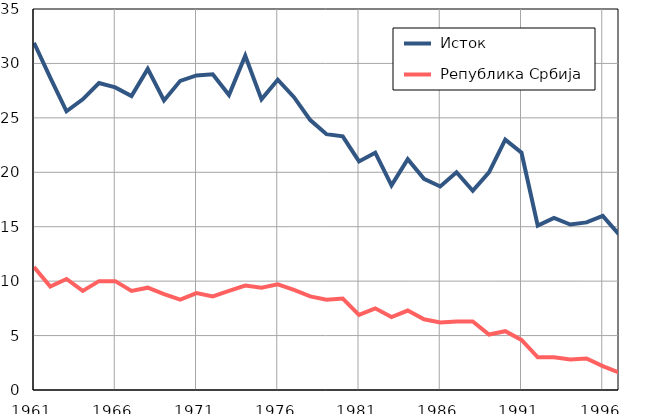
| Category |  Исток |  Република Србија |
|---|---|---|
| 1961.0 | 31.9 | 11.3 |
| 1962.0 | 28.7 | 9.5 |
| 1963.0 | 25.6 | 10.2 |
| 1964.0 | 26.7 | 9.1 |
| 1965.0 | 28.2 | 10 |
| 1966.0 | 27.8 | 10 |
| 1967.0 | 27 | 9.1 |
| 1968.0 | 29.5 | 9.4 |
| 1969.0 | 26.6 | 8.8 |
| 1970.0 | 28.4 | 8.3 |
| 1971.0 | 28.9 | 8.9 |
| 1972.0 | 29 | 8.6 |
| 1973.0 | 27.1 | 9.1 |
| 1974.0 | 30.7 | 9.6 |
| 1975.0 | 26.7 | 9.4 |
| 1976.0 | 28.5 | 9.7 |
| 1977.0 | 26.9 | 9.2 |
| 1978.0 | 24.8 | 8.6 |
| 1979.0 | 23.5 | 8.3 |
| 1980.0 | 23.3 | 8.4 |
| 1981.0 | 21 | 6.9 |
| 1982.0 | 21.8 | 7.5 |
| 1983.0 | 18.8 | 6.7 |
| 1984.0 | 21.2 | 7.3 |
| 1985.0 | 19.4 | 6.5 |
| 1986.0 | 18.7 | 6.2 |
| 1987.0 | 20 | 6.3 |
| 1988.0 | 18.3 | 6.3 |
| 1989.0 | 20 | 5.1 |
| 1990.0 | 23 | 5.4 |
| 1991.0 | 21.8 | 4.6 |
| 1992.0 | 15.1 | 3 |
| 1993.0 | 15.8 | 3 |
| 1994.0 | 15.2 | 2.8 |
| 1995.0 | 15.4 | 2.9 |
| 1996.0 | 16 | 2.2 |
| 1997.0 | 14.3 | 1.6 |